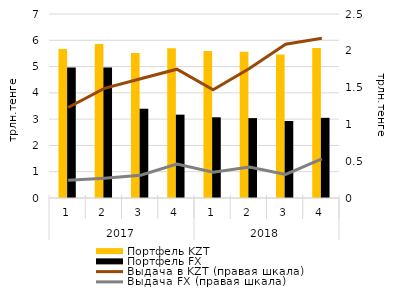
| Category | Портфель KZT | Портфель FX |
|---|---|---|
| 0 | 5.67 | 4.96 |
| 1 | 5.86 | 4.96 |
| 2 | 5.52 | 3.4 |
| 3 | 5.7 | 3.17 |
| 4 | 5.59 | 3.07 |
| 5 | 5.56 | 3.04 |
| 6 | 5.46 | 2.93 |
| 7 | 5.71 | 3.05 |